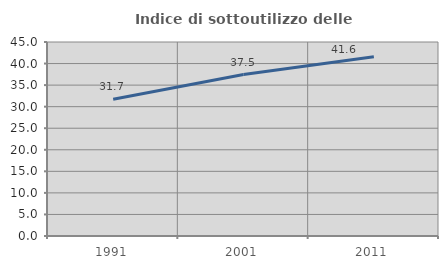
| Category | Indice di sottoutilizzo delle abitazioni  |
|---|---|
| 1991.0 | 31.739 |
| 2001.0 | 37.458 |
| 2011.0 | 41.582 |